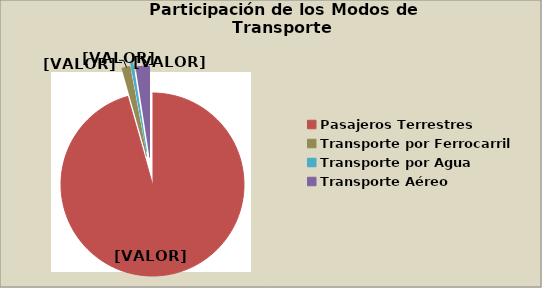
| Category | Series 0 |
|---|---|
| Pasajeros Terrestres | 95.619 |
| Transporte por Ferrocarril | 1.464 |
| Transporte por Agua | 0.474 |
| Transporte Aéreo | 2.443 |